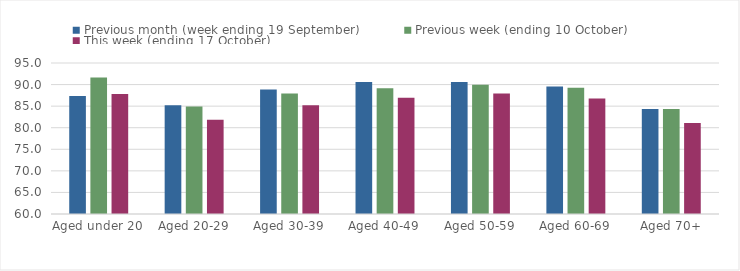
| Category | Previous month (week ending 19 September) | Previous week (ending 10 October) | This week (ending 17 October) |
|---|---|---|---|
| Aged under 20 | 87.35 | 91.62 | 87.8 |
| Aged 20-29 | 85.19 | 84.91 | 81.86 |
| Aged 30-39 | 88.84 | 87.91 | 85.21 |
| Aged 40-49 | 90.57 | 89.14 | 86.93 |
| Aged 50-59 | 90.57 | 89.94 | 87.95 |
| Aged 60-69 | 89.56 | 89.29 | 86.8 |
| Aged 70+ | 84.34 | 84.34 | 81.1 |